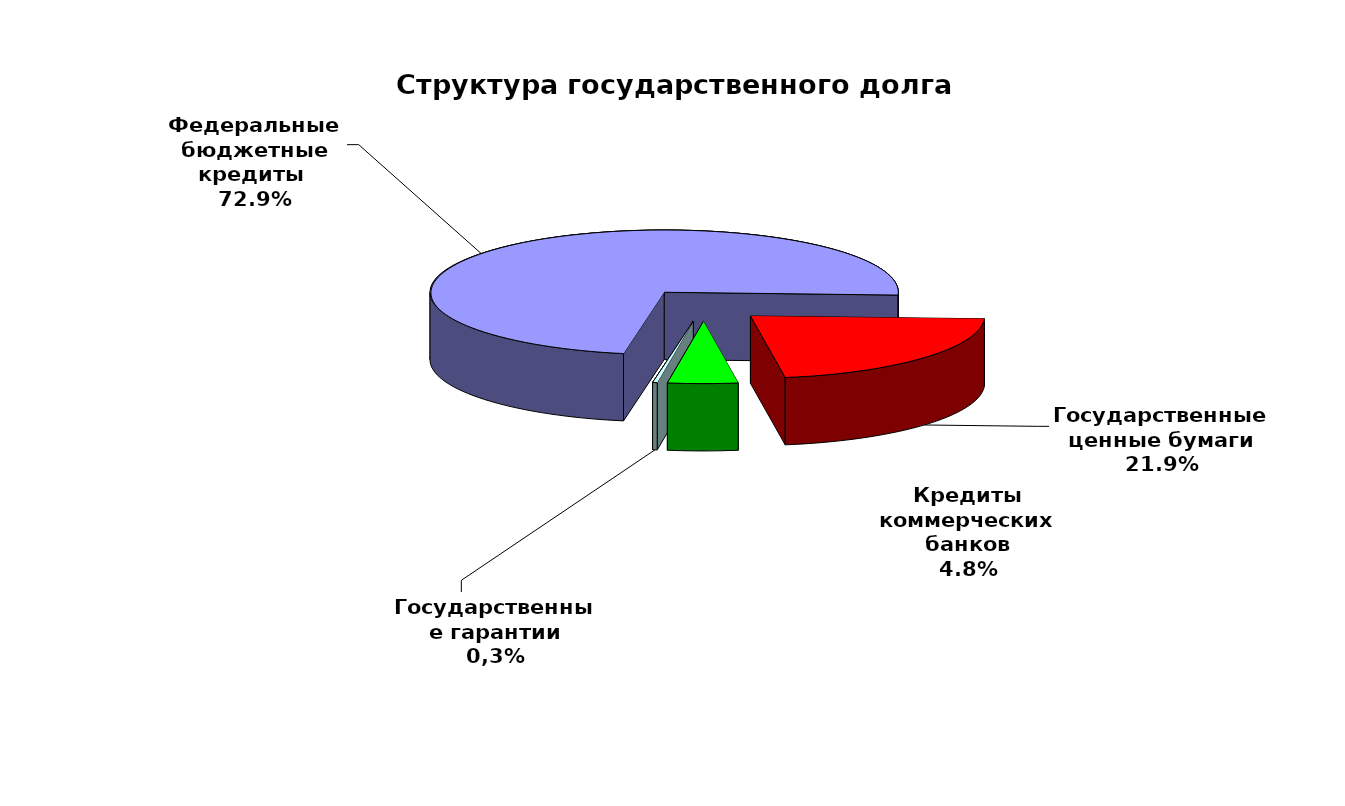
| Category | Series 0 |
|---|---|
| Федеральные бюджетные кредиты  | 113223150.103 |
| Государственные ценные бумаги | 34000000 |
| Кредиты коммерческих банков | 7500000 |
| Государственные гарантии | 492844.914 |